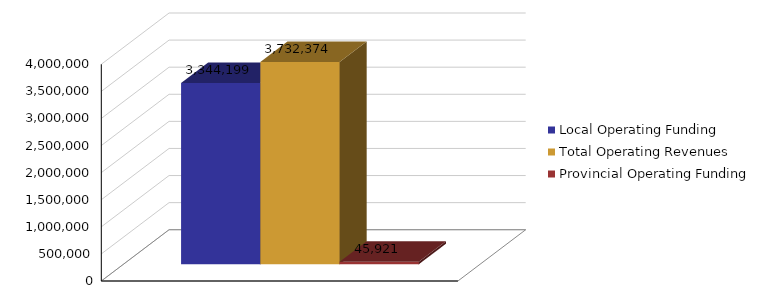
| Category | Local Operating Funding | Total Operating Revenues | Provincial Operating Funding |
|---|---|---|---|
|  | 3344199 | 3732374 | 45921 |